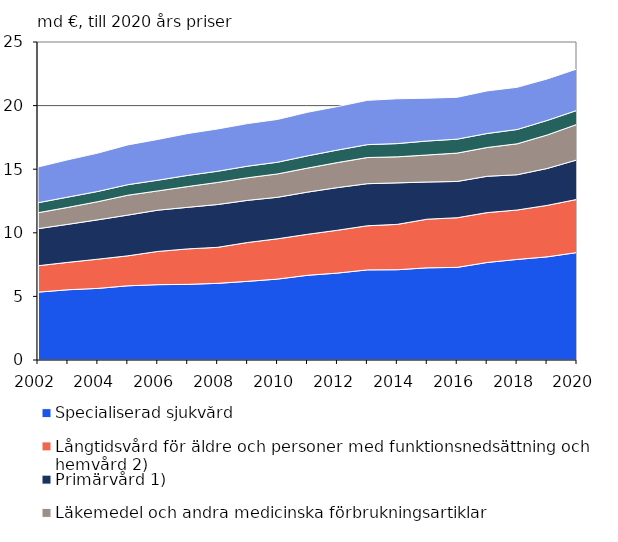
| Category | Specialiserad sjukvård | Långtidsvård för äldre och personer med funktionsnedsättning och hemvård 2)  | Primärvård 1) | Läkemedel och andra medicinska förbrukningsartiklar | Privat hälso- och sjukvård ersatt av sjukförsäkringen | Övrig hälso- och sjukvård |
|---|---|---|---|---|---|---|
| 2002 | 5.334 | 2.075 | 2.914 | 1.252 | 0.787 | 2.812 |
| 2003 | 5.523 | 2.155 | 2.989 | 1.332 | 0.808 | 2.934 |
| 2004 | 5.63 | 2.296 | 3.096 | 1.426 | 0.806 | 3.013 |
| 2005 | 5.835 | 2.356 | 3.202 | 1.563 | 0.83 | 3.127 |
| 2006 | 5.922 | 2.611 | 3.245 | 1.515 | 0.841 | 3.203 |
| 2007 | 5.947 | 2.789 | 3.269 | 1.632 | 0.877 | 3.288 |
| 2008 | 6.027 | 2.831 | 3.365 | 1.739 | 0.877 | 3.325 |
| 2009 | 6.184 | 3.054 | 3.312 | 1.776 | 0.912 | 3.348 |
| 2010 | 6.361 | 3.168 | 3.264 | 1.836 | 0.921 | 3.363 |
| 2011 | 6.66 | 3.222 | 3.316 | 1.889 | 0.963 | 3.424 |
| 2012 | 6.832 | 3.369 | 3.352 | 1.968 | 0.982 | 3.419 |
| 2013 | 7.085 | 3.469 | 3.307 | 2.056 | 1.014 | 3.483 |
| 2014 | 7.096 | 3.566 | 3.263 | 2.046 | 1.042 | 3.524 |
| 2015 | 7.246 | 3.826 | 2.921 | 2.125 | 1.098 | 3.367 |
| 2016 | 7.283 | 3.903 | 2.852 | 2.229 | 1.097 | 3.291 |
| 2017 | 7.666 | 3.92 | 2.857 | 2.265 | 1.099 | 3.348 |
| 2018 | 7.907 | 3.884 | 2.773 | 2.431 | 1.125 | 3.318 |
| 2019 | 8.108 | 4.046 | 2.899 | 2.633 | 1.143 | 3.263 |
| 2020 | 8.448 | 4.178 | 3.105 | 2.793 | 1.1 | 3.256 |